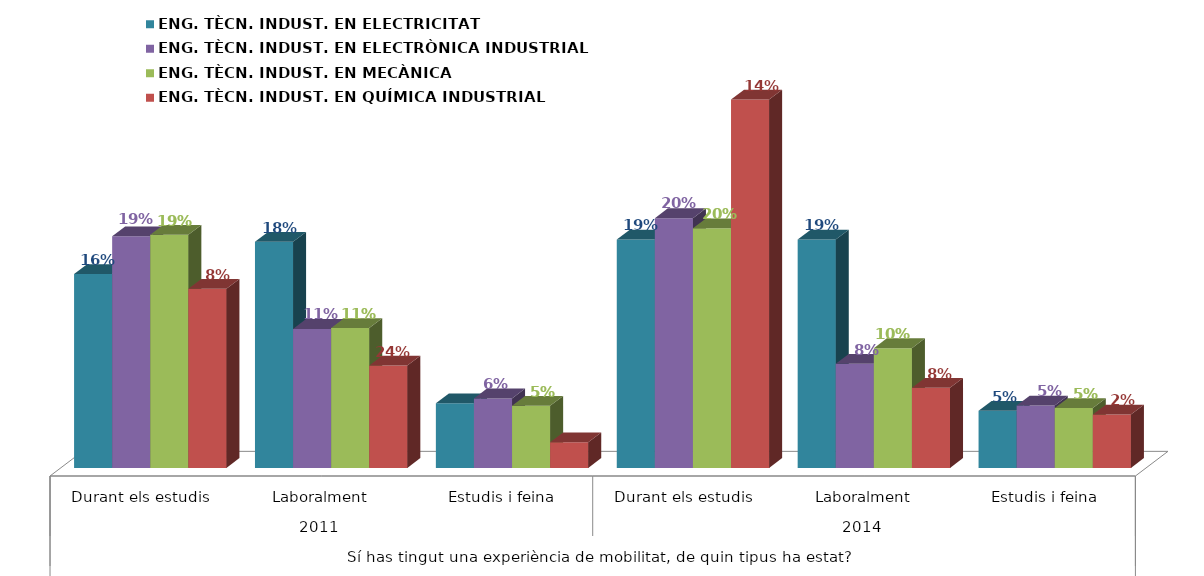
| Category | ENG. TÈCN. INDUST. EN ELECTRICITAT | ENG. TÈCN. INDUST. EN ELECTRÒNICA INDUSTRIAL | ENG. TÈCN. INDUST. EN MECÀNICA | ENG. TÈCN. INDUST. EN QUÍMICA INDUSTRIAL |
|---|---|---|---|---|
| 0 | 0.158 | 0.189 | 0.19 | 0.146 |
| 1 | 0.184 | 0.113 | 0.114 | 0.083 |
| 2 | 0.053 | 0.057 | 0.051 | 0.021 |
| 3 | 0.186 | 0.203 | 0.195 | 0.348 |
| 4 | 0.186 | 0.085 | 0.098 | 0.065 |
| 5 | 0.047 | 0.051 | 0.049 | 0.043 |